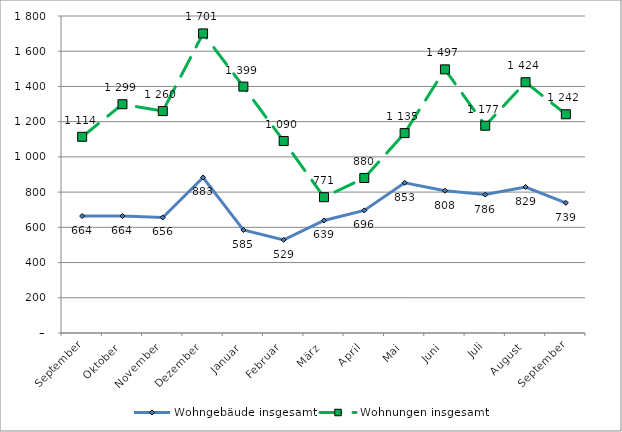
| Category | Wohngebäude insgesamt | Wohnungen insgesamt |
|---|---|---|
| September | 664 | 1114 |
| Oktober | 664 | 1299 |
| November | 656 | 1260 |
| Dezember | 883 | 1701 |
| Januar | 585 | 1399 |
| Februar | 529 | 1090 |
| März | 639 | 771 |
| April | 696 | 880 |
| Mai | 853 | 1135 |
| Juni | 808 | 1497 |
| Juli | 786 | 1177 |
| August | 829 | 1424 |
| September | 739 | 1242 |